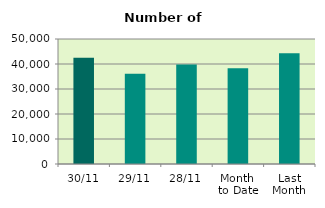
| Category | Series 0 |
|---|---|
| 30/11 | 42460 |
| 29/11 | 36052 |
| 28/11 | 39810 |
| Month 
to Date | 38326.182 |
| Last
Month | 44266.476 |